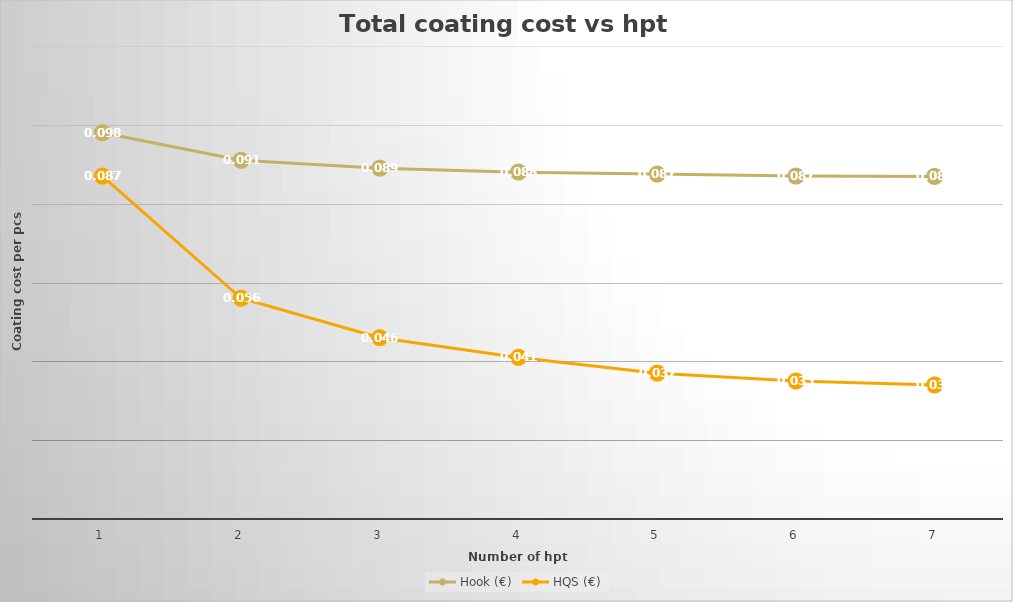
| Category | Hook (€) | HQS (€) |
|---|---|---|
| 1.0 | 0.098 | 0.087 |
| 2.0 | 0.091 | 0.056 |
| 3.0 | 0.089 | 0.046 |
| 4.0 | 0.088 | 0.041 |
| 5.0 | 0.088 | 0.037 |
| 6.0 | 0.087 | 0.035 |
| 7.0 | 0.087 | 0.034 |